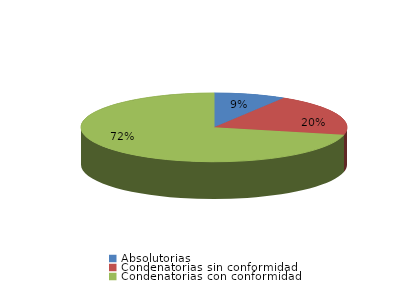
| Category | Series 0 |
|---|---|
| Absolutorias | 12 |
| Condenatorias sin conformidad | 27 |
| Condenatorias con conformidad | 98 |